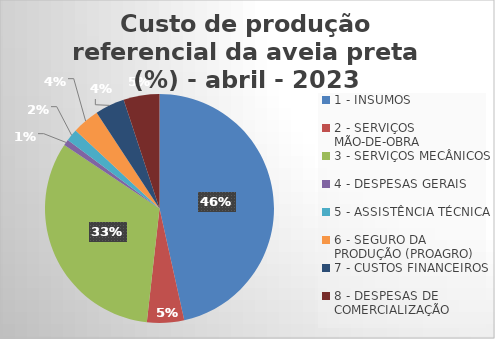
| Category | Series 0 |
|---|---|
| 1 - INSUMOS | 46.534 |
| 2 - SERVIÇOS MÃO-DE-OBRA | 5.235 |
| 3 - SERVIÇOS MECÂNICOS | 32.603 |
| 4 - DESPESAS GERAIS  | 0.844 |
| 5 - ASSISTÊNCIA TÉCNICA | 1.704 |
| 6 - SEGURO DA PRODUÇÃO (PROAGRO) | 3.835 |
| 7 - CUSTOS FINANCEIROS | 4.175 |
| 8 - DESPESAS DE COMERCIALIZAÇÃO | 5.071 |